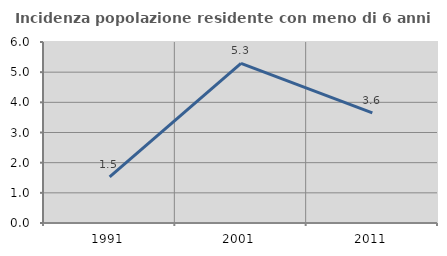
| Category | Incidenza popolazione residente con meno di 6 anni |
|---|---|
| 1991.0 | 1.528 |
| 2001.0 | 5.29 |
| 2011.0 | 3.647 |